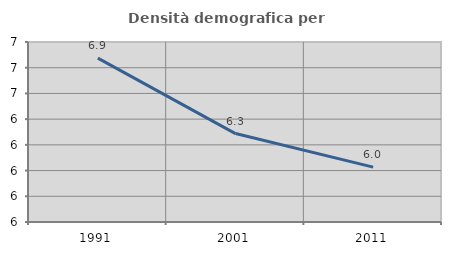
| Category | Densità demografica |
|---|---|
| 1991.0 | 6.875 |
| 2001.0 | 6.288 |
| 2011.0 | 6.027 |